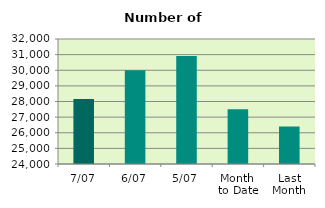
| Category | Series 0 |
|---|---|
| 7/07 | 28164 |
| 6/07 | 29994 |
| 5/07 | 30918 |
| Month 
to Date | 27506.4 |
| Last
Month | 26399.455 |